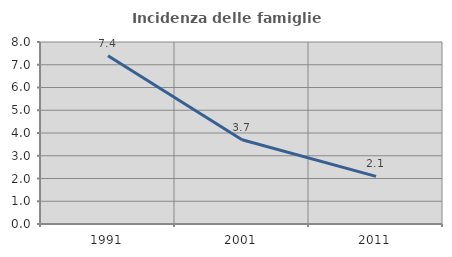
| Category | Incidenza delle famiglie numerose |
|---|---|
| 1991.0 | 7.397 |
| 2001.0 | 3.701 |
| 2011.0 | 2.095 |